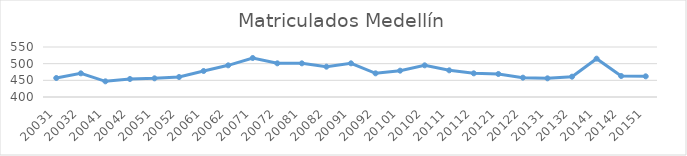
| Category | Matriculados Medellín |
|---|---|
| 20031 | 457 |
| 20032 | 471 |
| 20041 | 447 |
| 20042 | 454 |
| 20051 | 456 |
| 20052 | 460 |
| 20061 | 478 |
| 20062 | 495 |
| 20071 | 517 |
| 20072 | 501 |
| 20081 | 501 |
| 20082 | 491 |
| 20091 | 501 |
| 20092 | 471 |
| 20101 | 479 |
| 20102 | 495 |
| 20111 | 480 |
| 20112 | 471 |
| 20121 | 469 |
| 20122 | 458 |
| 20131 | 456 |
| 20132 | 461 |
| 20141 | 515 |
| 20142 | 463 |
| 20151 | 462 |